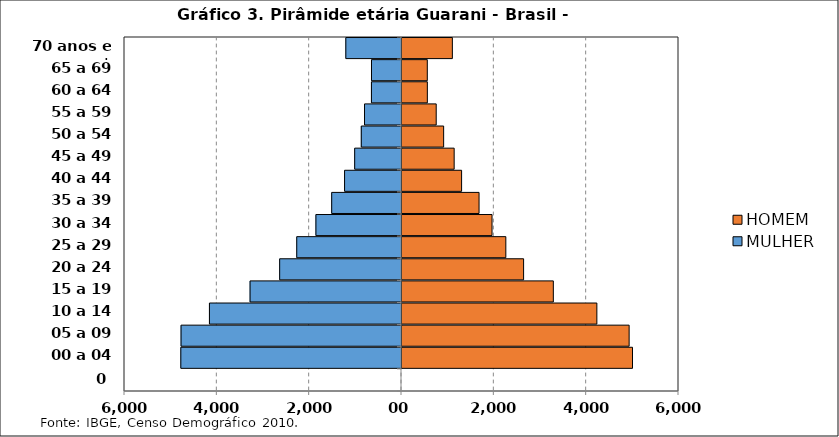
| Category | MULHER | HOMEM |
|---|---|---|
| 0 | 0 | 0 |
| 00 a 04 anos | -4780 | 4993 |
| 05 a 09 anos | -4775 | 4920 |
| 10 a 14 anos | -4160 | 4221 |
| 15 a 19 anos | -3280 | 3278 |
| 20 a 24 anos | -2639 | 2634 |
| 25 a 29 anos | -2269 | 2249 |
| 30 a 34 anos | -1854 | 1950 |
| 35 a 39 anos | -1512 | 1669 |
| 40 a 44 anos | -1233 | 1291 |
| 45 a 49 anos | -1014 | 1130 |
| 50 a 54 anos | -871 | 902 |
| 55 a 59 anos | -801 | 741 |
| 60 a 64 anos | -651 | 549 |
| 65 a 69 anos | -650 | 548 |
| 70 anos e + | -1206 | 1091 |